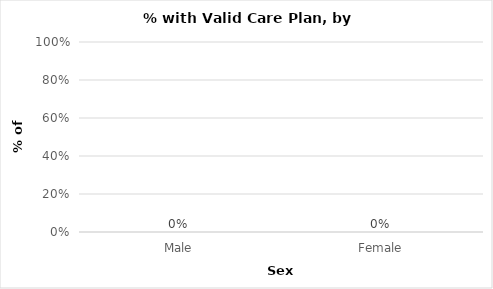
| Category | Children with a an individual care plan   |
|---|---|
| Male | 0 |
| Female | 0 |